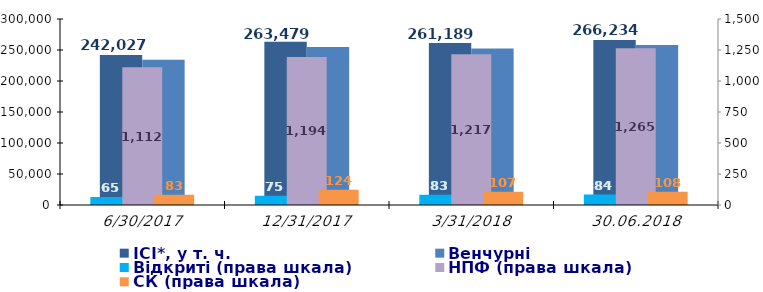
| Category | ІСІ*, у т. ч. | Венчурні |
|---|---|---|
| 30.06.2017 | 242027.453 | 234376.575 |
| 31.12.2017 | 263479.382 | 254957.863 |
| 31.03.2018 | 261188.737 | 252508.217 |
| 30.06.2018 | 266234.143 | 257881.459 |